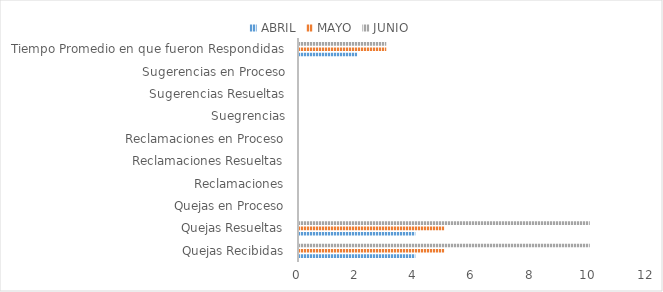
| Category | ABRIL | MAYO | JUNIO |
|---|---|---|---|
| Quejas Recibidas | 4 | 5 | 10 |
| Quejas Resueltas | 4 | 5 | 10 |
| Quejas en Proceso | 0 | 0 | 0 |
| Reclamaciones | 0 | 0 | 0 |
| Reclamaciones Resueltas | 0 | 0 | 0 |
| Reclamaciones en Proceso | 0 | 0 | 0 |
| Suegrencias | 0 | 0 | 0 |
| Sugerencias Resueltas | 0 | 0 | 0 |
| Sugerencias en Proceso | 0 | 0 | 0 |
| Tiempo Promedio en que fueron Respondidas | 2 | 3 | 3 |